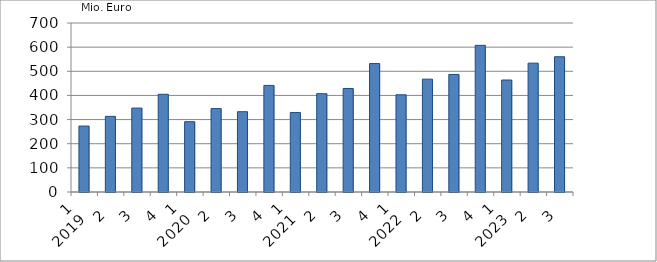
| Category | Ausbaugewerblicher Umsatz3 |
|---|---|
| 0 | 273159.137 |
| 1 | 313254.251 |
| 2 | 347631.281 |
| 3 | 404721.054 |
| 4 | 291272.144 |
| 5 | 345494.215 |
| 6 | 332629.265 |
| 7 | 441463.36 |
| 8 | 329380.212 |
| 9 | 407164.972 |
| 10 | 428783.222 |
| 11 | 532137.089 |
| 12 | 402625.565 |
| 13 | 467398.849 |
| 14 | 486819.26 |
| 15 | 607390.303 |
| 16 | 463895.067 |
| 17 | 533766.53 |
| 18 | 560194.5 |